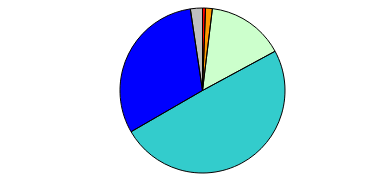
| Category | Series 0 |
|---|---|
| 0 | 4 |
| 1 | 9 |
| 2 | 103 |
| 3 | 336 |
| 4 | 210 |
| 5 | 16 |